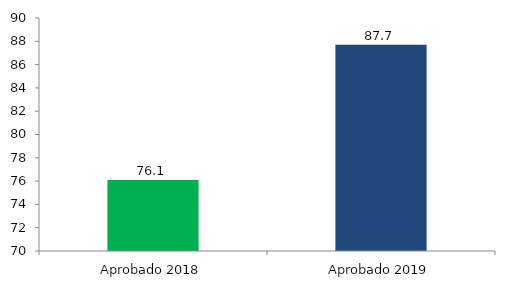
| Category | Series 0 |
|---|---|
| Aprobado 2018 | 76.1 |
| Aprobado 2019 | 87.7 |